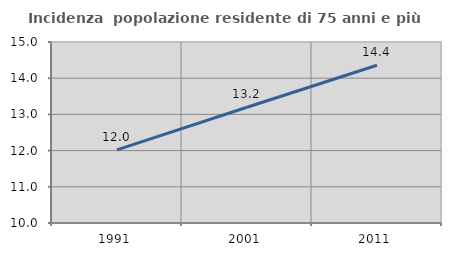
| Category | Incidenza  popolazione residente di 75 anni e più |
|---|---|
| 1991.0 | 12.02 |
| 2001.0 | 13.196 |
| 2011.0 | 14.358 |